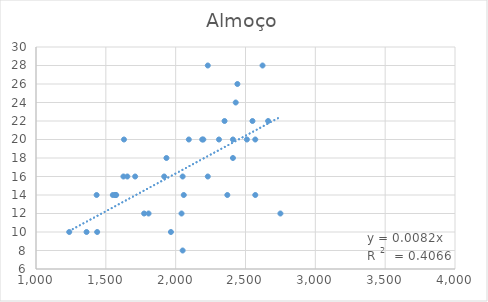
| Category | Almoço |
|---|---|
| 1550.0 | 14 |
| 2310.0 | 20 |
| 1570.0 | 14 |
| 2042.0 | 12 |
| 1934.0 | 18 |
| 1630.0 | 20 |
| 1574.0 | 14 |
| 1566.0 | 14 |
| 2050.0 | 8 |
| 2350.0 | 22 |
| 1918.0 | 16 |
| 1438.0 | 10 |
| 1654.0 | 16 |
| 2058.0 | 14 |
| 2442.0 | 26 |
| 2050.0 | 16 |
| 1966.0 | 10 |
| 2550.0 | 22 |
| 2198.0 | 20 |
| 1626.0 | 16 |
| 2510.0 | 20 |
| 2410.0 | 20 |
| 2622.0 | 28 |
| 1362.0 | 10 |
| 2750.0 | 12 |
| 1806.0 | 12 |
| 2190.0 | 20 |
| 2430.0 | 24 |
| 2094.0 | 20 |
| 2570.0 | 20 |
| 2410.0 | 18 |
| 1774.0 | 12 |
| 1710.0 | 16 |
| 2370.0 | 14 |
| 2230.0 | 16 |
| 2570.0 | 14 |
| 2662.0 | 22 |
| 1238.0 | 10 |
| 2230.0 | 28 |
| 1434.0 | 14 |